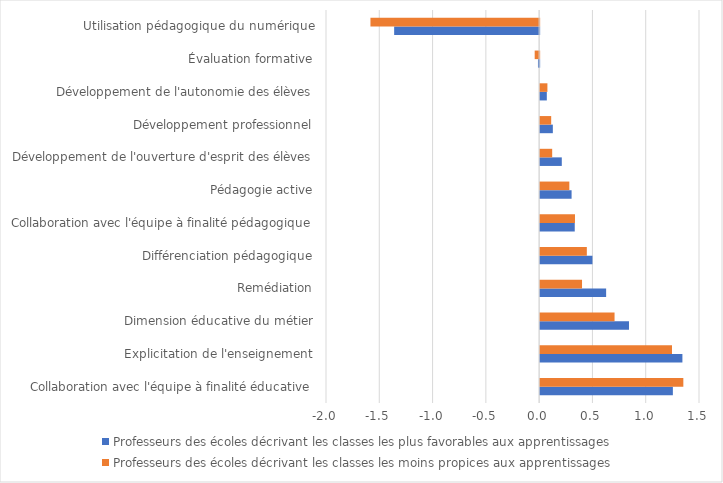
| Category | Professeurs des écoles décrivant les classes les plus favorables aux apprentissages | Professeurs des écoles décrivant les classes les moins propices aux apprentissages |
|---|---|---|
| Collaboration avec l'équipe à finalité éducative | 1.245 | 1.344 |
| Explicitation de l'enseignement | 1.335 | 1.237 |
| Dimension éducative du métier | 0.834 | 0.698 |
| Remédiation | 0.619 | 0.393 |
| Différenciation pédagogique | 0.491 | 0.438 |
| Collaboration avec l'équipe à finalité pédagogique | 0.325 | 0.327 |
| Pédagogie active | 0.295 | 0.274 |
| Développement de l'ouverture d'esprit des élèves | 0.203 | 0.113 |
| Développement professionnel | 0.119 | 0.104 |
| Développement de l'autonomie des élèves | 0.063 | 0.068 |
| Évaluation formative | -0.011 | -0.042 |
| Utilisation pédagogique du numérique | -1.36 | -1.583 |